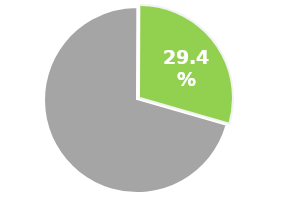
| Category | Series 0 |
|---|---|
| 0 | 0.706 |
| 1 | 0.294 |